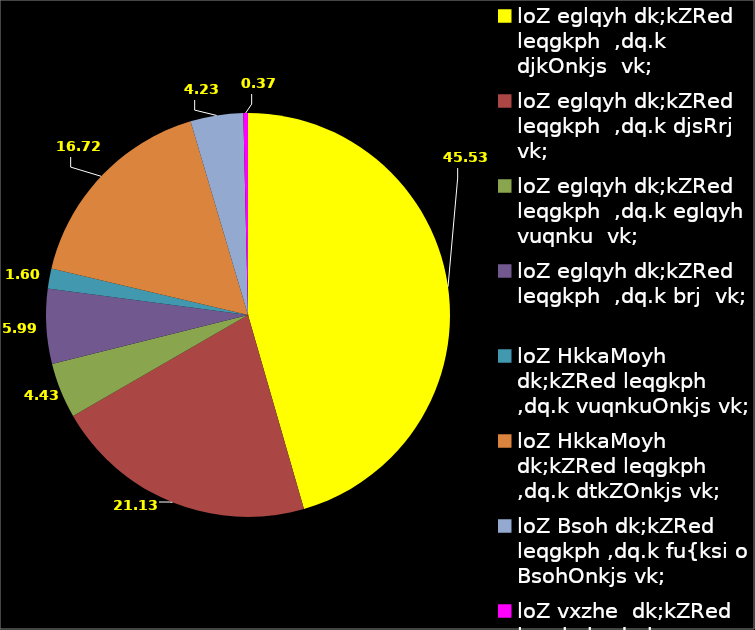
| Category | Series 0 |
|---|---|
| loZ eglqyh dk;kZRed leqgkph  ,dq.k djkOnkjs  vk; | 45.533 |
| loZ eglqyh dk;kZRed leqgkph  ,dq.k djsRrj vk; | 21.134 |
| loZ eglqyh dk;kZRed leqgkph  ,dq.k eglqyh vuqnku  vk; | 4.432 |
| loZ eglqyh dk;kZRed leqgkph  ,dq.k brj  vk; | 5.994 |
| loZ HkkaMoyh dk;kZRed leqgkph ,dq.k vuqnkuOnkjs vk; | 1.596 |
| loZ HkkaMoyh dk;kZRed leqgkph ,dq.k dtkZOnkjs vk; | 16.717 |
| loZ Bsoh dk;kZRed leqgkph ,dq.k fu{ksi o BsohOnkjs vk; | 4.227 |
| loZ vxzhe  dk;kZRed leqgkph ,dq.k vxzheOnkjs vk; | 0.368 |